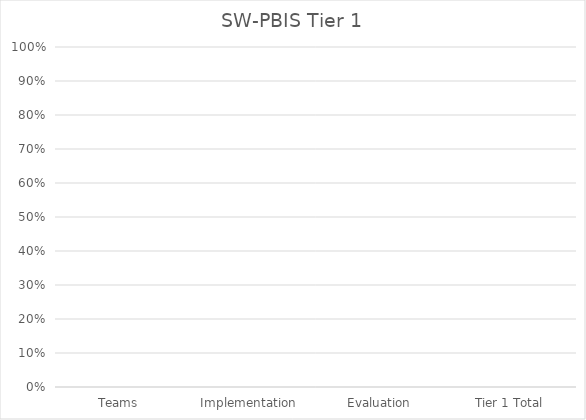
| Category | Series 0 |
|---|---|
| Teams | 0 |
| Implementation | 0 |
| Evaluation | 0 |
| Tier 1 Total | 0 |